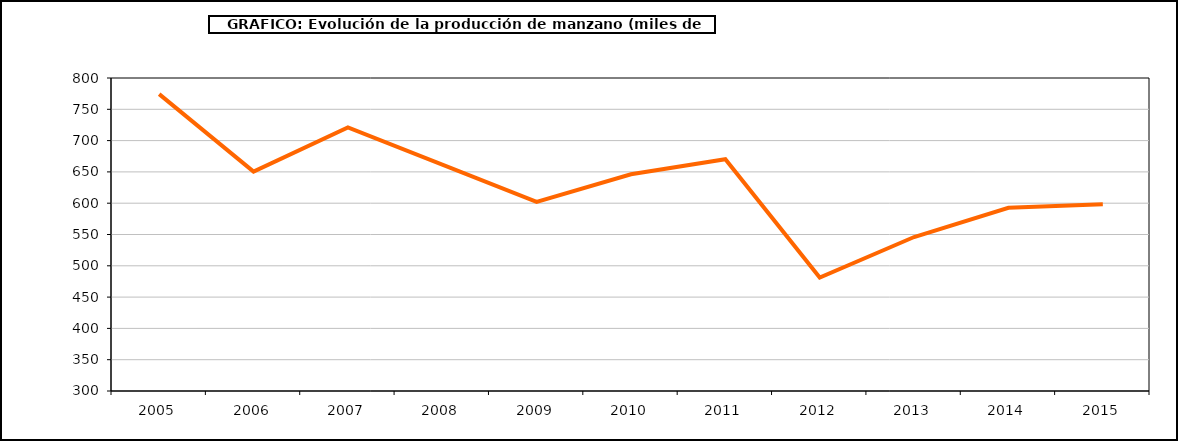
| Category | producción manzano |
|---|---|
| 2005.0 | 774.21 |
| 2006.0 | 650.384 |
| 2007.0 | 721.178 |
| 2008.0 | 661.724 |
| 2009.0 | 601.979 |
| 2010.0 | 646.264 |
| 2011.0 | 670.284 |
| 2012.0 | 481.223 |
| 2013.0 | 545.992 |
| 2014.0 | 592.576 |
| 2015.0 | 598.207 |